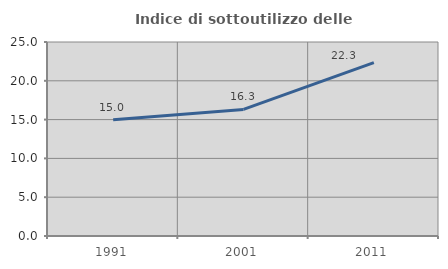
| Category | Indice di sottoutilizzo delle abitazioni  |
|---|---|
| 1991.0 | 14.988 |
| 2001.0 | 16.307 |
| 2011.0 | 22.342 |